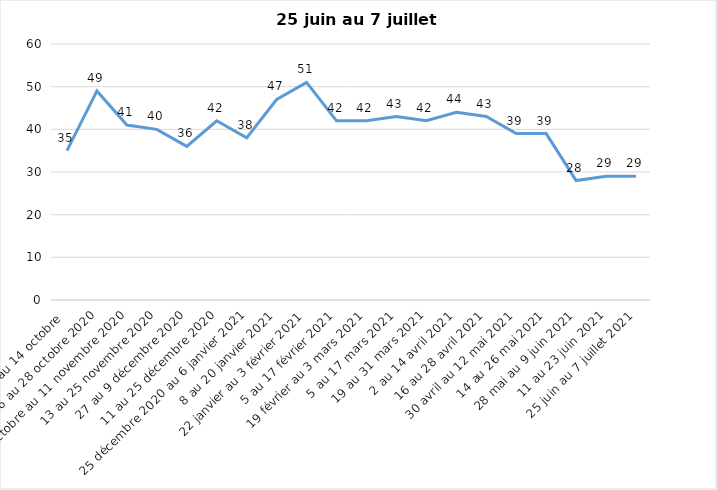
| Category | Toujours aux trois mesures |
|---|---|
| 2 au 14 octobre  | 35 |
| 16 au 28 octobre 2020 | 49 |
| 30 octobre au 11 novembre 2020 | 41 |
| 13 au 25 novembre 2020 | 40 |
| 27 au 9 décembre 2020 | 36 |
| 11 au 25 décembre 2020 | 42 |
| 25 décembre 2020 au 6 janvier 2021 | 38 |
| 8 au 20 janvier 2021 | 47 |
| 22 janvier au 3 février 2021 | 51 |
| 5 au 17 février 2021 | 42 |
| 19 février au 3 mars 2021 | 42 |
| 5 au 17 mars 2021 | 43 |
| 19 au 31 mars 2021 | 42 |
| 2 au 14 avril 2021 | 44 |
| 16 au 28 avril 2021 | 43 |
| 30 avril au 12 mai 2021 | 39 |
| 14 au 26 mai 2021 | 39 |
| 28 mai au 9 juin 2021 | 28 |
| 11 au 23 juin 2021 | 29 |
| 25 juin au 7 juillet 2021 | 29 |